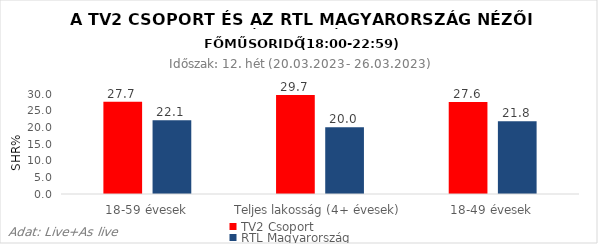
| Category | TV2 Csoport | RTL Magyarország |
|---|---|---|
| 18-59 évesek | 27.7 | 22.1 |
| Teljes lakosság (4+ évesek) | 29.7 | 20 |
| 18-49 évesek | 27.6 | 21.8 |